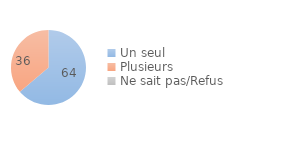
| Category | Series 0 |
|---|---|
| Un seul | 63.81 |
| Plusieurs  | 36.19 |
| Ne sait pas/Refus | 0 |